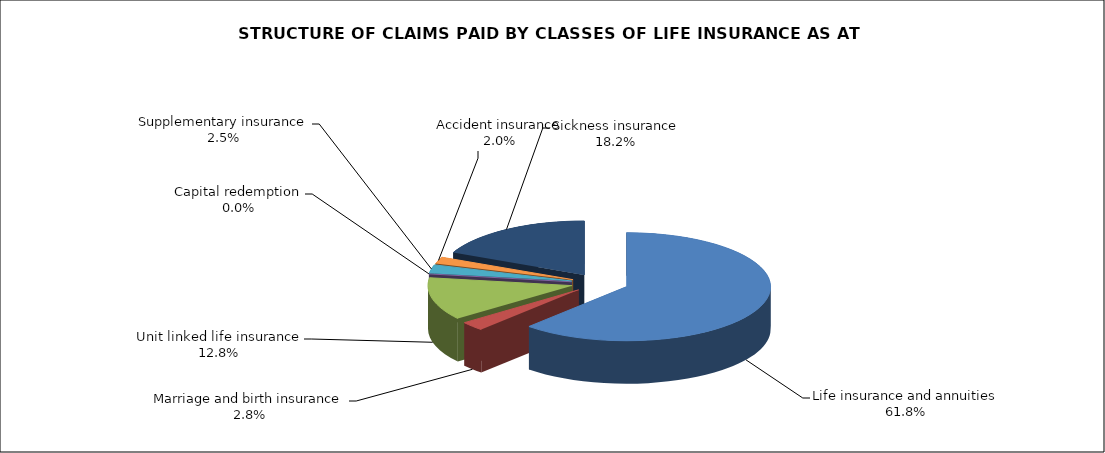
| Category | Life insurance and annuities |
|---|---|
| Life insurance and annuities | 166120020.766 |
| Marriage and birth insurance | 7399569.738 |
| Unit linked life insurance | 34291788.788 |
| Capital redemption | 0 |
| Supplementary insurance | 6694238.373 |
| Accident insurance | 5369945.442 |
| Sickness insurance | 48839771.094 |